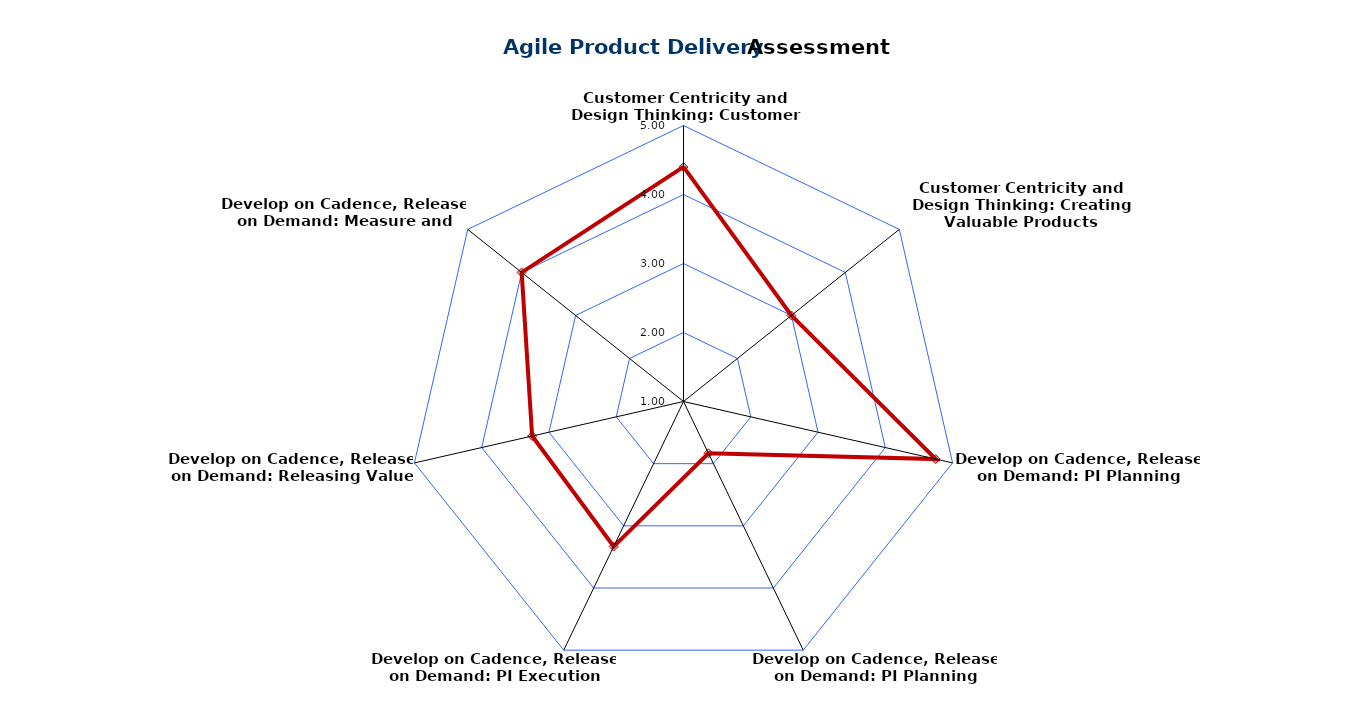
| Category | Series 0 |
|---|---|
| Customer Centricity and Design Thinking: Customer Needs | 4.4 |
| Customer Centricity and Design Thinking: Creating Valuable Products | 3 |
| Develop on Cadence, Release on Demand: PI Planning Preparation | 4.75 |
| Develop on Cadence, Release on Demand: PI Planning | 1.833 |
| Develop on Cadence, Release on Demand: PI Execution | 3.333 |
| Develop on Cadence, Release on Demand: Releasing Value | 3.25 |
| Develop on Cadence, Release on Demand: Measure and Learn | 4 |